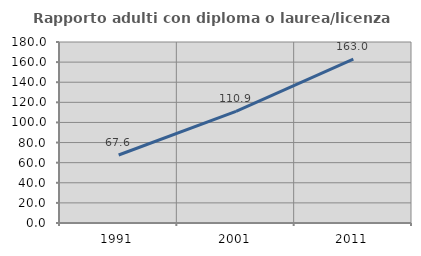
| Category | Rapporto adulti con diploma o laurea/licenza media  |
|---|---|
| 1991.0 | 67.647 |
| 2001.0 | 110.92 |
| 2011.0 | 162.951 |